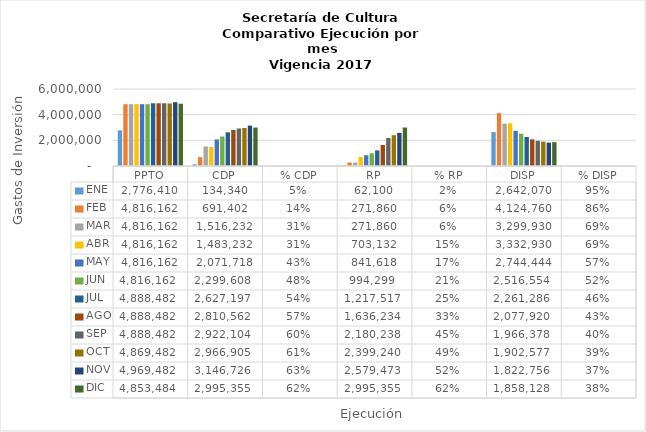
| Category | ENE | FEB | MAR | ABR | MAY  | JUN  | JUL | AGO | SEP | OCT | NOV | DIC |
|---|---|---|---|---|---|---|---|---|---|---|---|---|
| PPTO | 2776409.833 | 4816161.827 | 4816161.827 | 4816161.827 | 4816161.827 | 4816161.827 | 4888482.262 | 4888482.262 | 4888482.262 | 4869482.262 | 4969482.262 | 4853483.592 |
| CDP | 134340 | 691402 | 1516232 | 1483232 | 2071717.667 | 2299607.667 | 2627196.501 | 2810561.871 | 2922103.871 | 2966905.2 | 3146726.403 | 2995355.42 |
| % CDP | 0.048 | 0.144 | 0.315 | 0.308 | 0.43 | 0.477 | 0.537 | 0.575 | 0.598 | 0.609 | 0.633 | 0.617 |
| RP | 62100 | 271860 | 271860 | 703132 | 841617.667 | 994298.577 | 1217517.167 | 1636234.446 | 2180238.481 | 2399240.481 | 2579473.013 | 2995355.42 |
| % RP | 0.022 | 0.056 | 0.056 | 0.146 | 0.175 | 0.206 | 0.249 | 0.335 | 0.446 | 0.493 | 0.519 | 0.617 |
| DISP | 2642069.833 | 4124759.827 | 3299929.827 | 3332929.827 | 2744444.16 | 2516554.16 | 2261285.761 | 2077920.391 | 1966378.391 | 1902577.062 | 1822755.859 | 1858128.172 |
| % DISP | 0.952 | 0.856 | 0.685 | 0.692 | 0.57 | 0.523 | 0.463 | 0.425 | 0.402 | 0.391 | 0.367 | 0.383 |